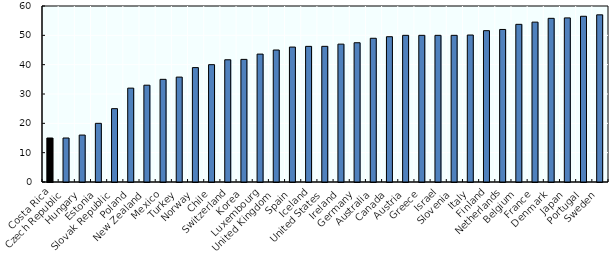
| Category | Top PIT rate 2015 |
|---|---|
| Costa Rica | 15 |
| Czech Republic | 15 |
| Hungary | 16 |
| Estonia | 20 |
| Slovak Republic | 25 |
| Poland | 32 |
| New Zealand | 33 |
| Mexico | 35 |
| Turkey | 35.76 |
| Norway | 39 |
| Chile | 40 |
| Switzerland | 41.67 |
| Korea | 41.8 |
| Luxembourg | 43.6 |
| United Kingdom | 45 |
| Spain | 46 |
| Iceland | 46.24 |
| United States | 46.25 |
| Ireland | 47 |
| Germany | 47.475 |
| Australia | 49 |
| Canada | 49.53 |
| Austria | 50 |
| Greece | 50 |
| Israel | 50 |
| Slovenia | 50 |
| Italy | 50.103 |
| Finland | 51.59 |
| Netherlands | 52 |
| Belgium | 53.75 |
| France | 54.501 |
| Denmark | 55.794 |
| Japan | 55.945 |
| Portugal | 56.5 |
| Sweden | 56.99 |